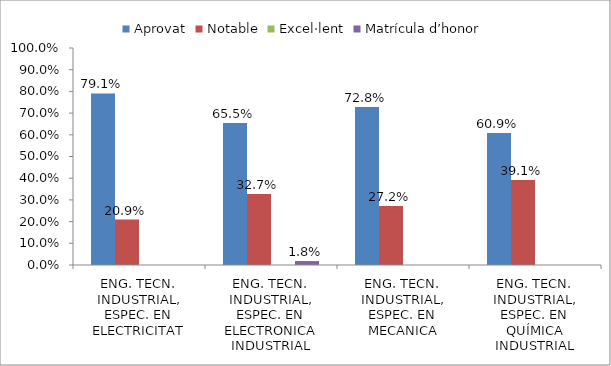
| Category | Aprovat | Notable | Excel·lent | Matrícula d’honor |
|---|---|---|---|---|
| ENG. TECN. INDUSTRIAL, ESPEC. EN ELECTRICITAT | 0.791 | 0.209 | 0 | 0 |
| ENG. TECN. INDUSTRIAL, ESPEC. EN ELECTRONICA INDUSTRIAL | 0.655 | 0.327 | 0 | 0.018 |
| ENG. TECN. INDUSTRIAL, ESPEC. EN MECANICA | 0.728 | 0.272 | 0 | 0 |
| ENG. TECN. INDUSTRIAL, ESPEC. EN QUÍMICA INDUSTRIAL | 0.609 | 0.391 | 0 | 0 |